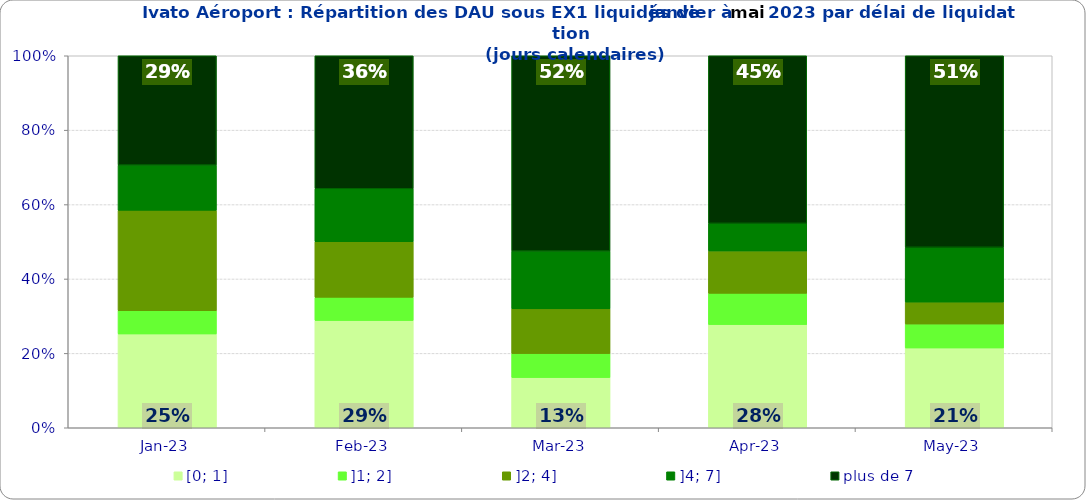
| Category | [0; 1] | ]1; 2] | ]2; 4] | ]4; 7] | plus de 7 |
|---|---|---|---|---|---|
| 2023-01-01 | 0.252 | 0.062 | 0.27 | 0.122 | 0.294 |
| 2023-02-01 | 0.288 | 0.062 | 0.149 | 0.142 | 0.358 |
| 2023-03-01 | 0.135 | 0.065 | 0.12 | 0.155 | 0.525 |
| 2023-04-01 | 0.277 | 0.084 | 0.114 | 0.074 | 0.45 |
| 2023-05-01 | 0.214 | 0.064 | 0.059 | 0.147 | 0.515 |